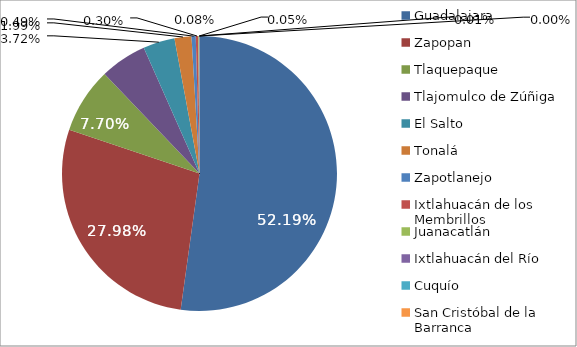
| Category | Series 0 |
|---|---|
| Guadalajara | 684386 |
| Zapopan | 366870 |
| Tlaquepaque | 100996 |
| Tlajomulco de Zúñiga | 71980 |
| El Salto | 48805 |
| Tonalá | 26145 |
| Zapotlanejo | 6464 |
| Ixtlahuacán de los Membrillos | 3893 |
| Juanacatlán | 1023 |
| Ixtlahuacán del Río | 592 |
| Cuquío | 175 |
| San Cristóbal de la Barranca | 19 |